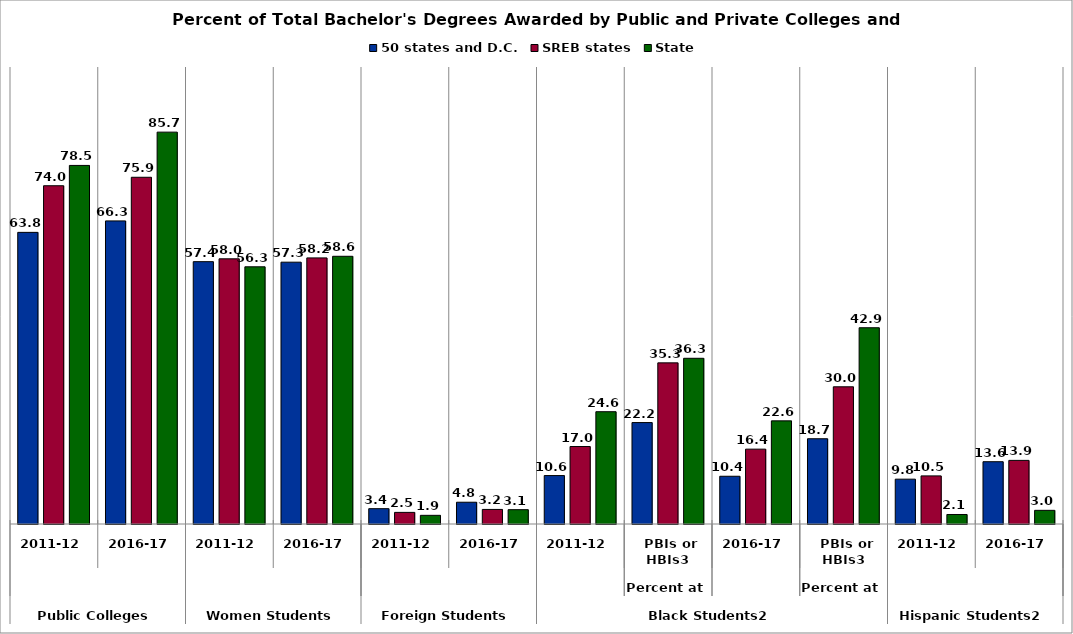
| Category | 50 states and D.C. | SREB states | State |
|---|---|---|---|
| 0 | 63.814 | 74.016 | 78.461 |
| 1 | 66.319 | 75.87 | 85.746 |
| 2 | 57.404 | 58.026 | 56.278 |
| 3 | 57.29 | 58.228 | 58.58 |
| 4 | 3.352 | 2.543 | 1.895 |
| 5 | 4.765 | 3.188 | 3.134 |
| 6 | 10.597 | 16.952 | 24.569 |
| 7 | 22.196 | 35.258 | 36.261 |
| 8 | 10.447 | 16.378 | 22.566 |
| 9 | 18.656 | 30.022 | 42.944 |
| 10 | 9.81 | 10.53 | 2.081 |
| 11 | 13.628 | 13.921 | 2.991 |